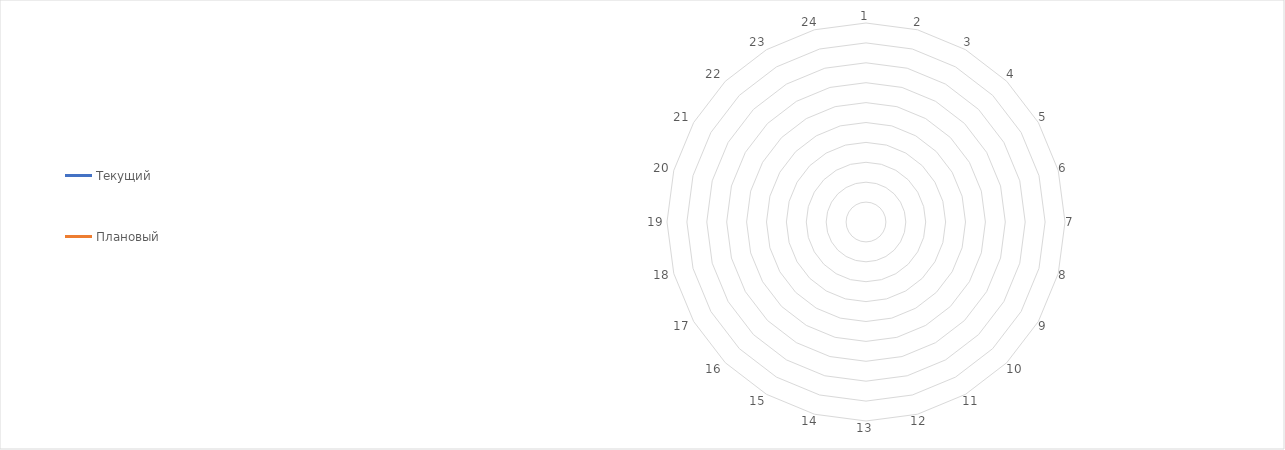
| Category | Текущий | Плановый |
|---|---|---|
| 1.0 | 0 | 0 |
| 2.0 | 0 | 0 |
| 3.0 | 0 | 0 |
| 4.0 | 0 | 0 |
| 5.0 | 0 | 0 |
| 6.0 | 0 | 0 |
| 7.0 | 0 | 0 |
| 8.0 | 0 | 0 |
| 9.0 | 0 | 0 |
| 10.0 | 0 | 0 |
| 11.0 | 0 | 0 |
| 12.0 | 0 | 0 |
| 13.0 | 0 | 0 |
| 14.0 | 0 | 0 |
| 15.0 | 0 | 0 |
| 16.0 | 0 | 0 |
| 17.0 | 0 | 0 |
| 18.0 | 0 | 0 |
| 19.0 | 0 | 0 |
| 20.0 | 0 | 0 |
| 21.0 | 0 | 0 |
| 22.0 | 0 | 0 |
| 23.0 | 0 | 0 |
| 24.0 | 0 | 0 |